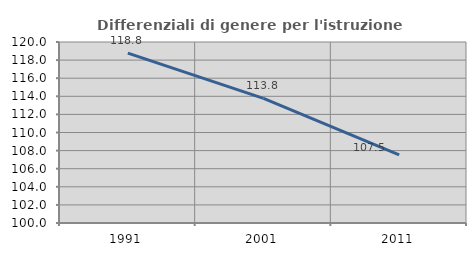
| Category | Differenziali di genere per l'istruzione superiore |
|---|---|
| 1991.0 | 118.773 |
| 2001.0 | 113.773 |
| 2011.0 | 107.524 |